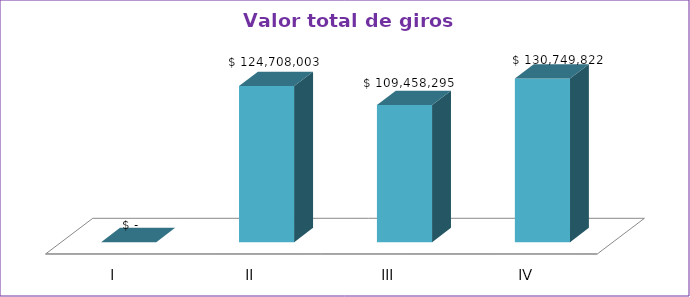
| Category | Series 0 |
|---|---|
| I | 0 |
| II | 124708003 |
| III | 109458295 |
| IV | 130749822 |